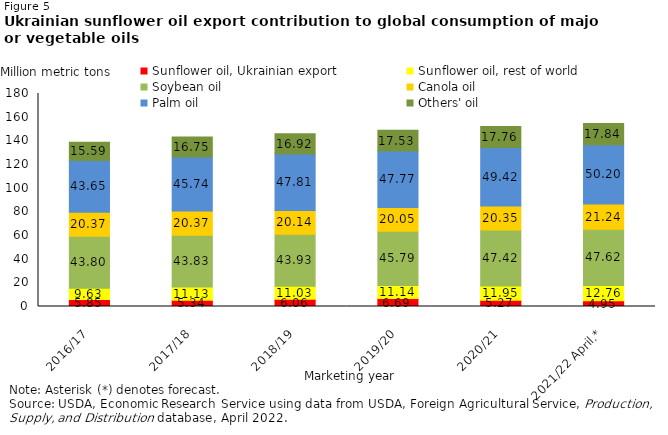
| Category | Sunflower oil, Ukrainian export | Sunflower oil, rest of world | Soybean oil  | Canola oil  | Palm oil  | Others' oil  |
|---|---|---|---|---|---|---|
| 2016/17 | 5.851 | 9.631 | 43.796 | 20.371 | 43.654 | 15.592 |
| 2017/18 | 5.342 | 11.134 | 43.832 | 20.37 | 45.744 | 16.746 |
| 2018/19 | 6.063 | 11.034 | 43.925 | 20.135 | 47.805 | 16.919 |
| 2019/20 | 6.686 | 11.144 | 45.791 | 20.053 | 47.772 | 17.526 |
| 2020/21 | 5.273 | 11.951 | 47.417 | 20.349 | 49.423 | 17.757 |
| 2021/22 April.* | 4.95 | 12.757 | 47.617 | 21.236 | 50.2 | 17.836 |